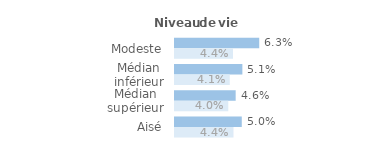
| Category | Series 1 | Series 0 |
|---|---|---|
| Modeste | 0.063 | 0.044 |
| Médian inférieur | 0.051 | 0.041 |
| Médian supérieur | 0.046 | 0.04 |
| Aisé | 0.05 | 0.044 |